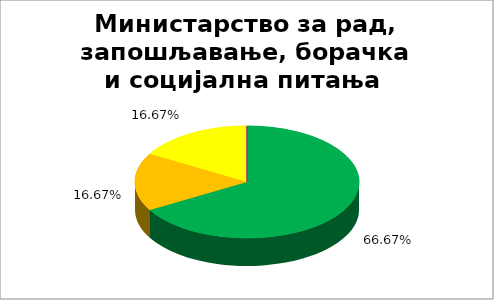
| Category | Министарство за рад, запошљавање, борачка и социјална питања  |
|---|---|
| 0 | 0.667 |
| 1 | 0.167 |
| 2 | 0.167 |
| 3 | 0 |
| 4 | 0 |